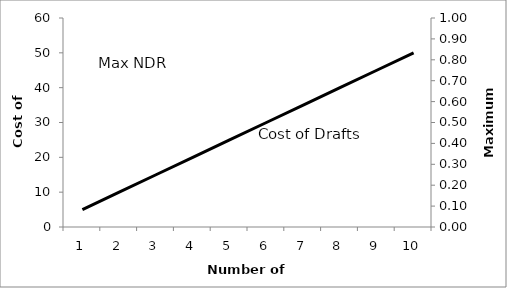
| Category | Series 2 |
|---|---|
| 1.0 | 5 |
| 2.0 | 10 |
| 3.0 | 15 |
| 4.0 | 20 |
| 5.0 | 25 |
| 6.0 | 30 |
| 7.0 | 35 |
| 8.0 | 40 |
| 9.0 | 45 |
| 10.0 | 50 |